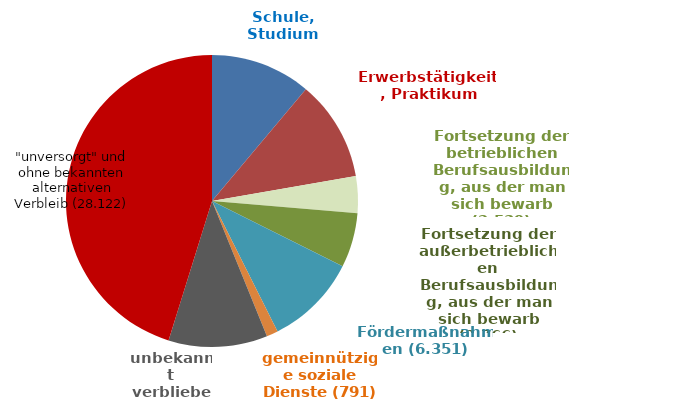
| Category | Verbleib der Bewerber die nicht in eine Berufsausbildung einmündeten |
|---|---|
| Schule, Studium | 6916 |
| Erwerbstätigkeit, Praktikum | 6933 |
| Fortsetzung der betrieblichen Berufsausbildung, aus der man sich bewarb | 2539 |
| Fortsetzung der außerbetrieblichen Berufsausbildung, aus der man sich bewarb | 3766 |
| Fördermaßnahmen | 6351 |
| gemeinnützige soziale Dienste | 791 |
| unbekannt verblieben | 6816 |
| unversorgt und ohne alternativen Verbleib | 28122 |